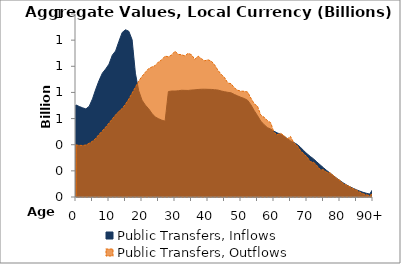
| Category | Public Transfers, Inflows | Public Transfers, Outflows |
|---|---|---|
| 0 | 703.988 | 397.538 |
|  | 692.429 | 395.395 |
| 2 | 682.373 | 394.039 |
| 3 | 673.781 | 397.855 |
| 4 | 693.748 | 410.843 |
| 5 | 750.663 | 426.653 |
| 6 | 825.399 | 448.756 |
| 7 | 892.271 | 479.111 |
| 8 | 947.813 | 505.609 |
| 9 | 979.52 | 534.789 |
| 10 | 1016.507 | 565.162 |
| 11 | 1084.725 | 597.148 |
| 12 | 1117.315 | 627.985 |
| 13 | 1190.292 | 655.109 |
| 14 | 1258.669 | 677.196 |
| 15 | 1279.497 | 710.413 |
| 16 | 1267.957 | 749.412 |
| 17 | 1203.711 | 795.012 |
| 18 | 947.044 | 839.92 |
| 19 | 813.417 | 886.302 |
| 20 | 740.835 | 922.697 |
| 21 | 703.402 | 953.783 |
| 22 | 675.582 | 982.051 |
| 23 | 639.759 | 994.708 |
| 24 | 612.16 | 1005.906 |
| 25 | 599.075 | 1033.315 |
| 26 | 587.662 | 1049.775 |
| 27 | 580.372 | 1077.929 |
| 28 | 806.477 | 1072.423 |
| 29 | 810.959 | 1086.735 |
| 30 | 810.624 | 1115.183 |
| 31 | 812.666 | 1091.091 |
| 32 | 816.584 | 1088.588 |
| 33 | 815.806 | 1079.487 |
| 34 | 815.218 | 1099.441 |
| 35 | 818.435 | 1088.16 |
| 36 | 819.839 | 1053.236 |
| 37 | 822.538 | 1077.811 |
| 38 | 824.343 | 1058.094 |
| 39 | 824.58 | 1042.285 |
| 40 | 823.686 | 1049.576 |
| 41 | 823.008 | 1039.666 |
| 42 | 820.368 | 1010.798 |
| 43 | 818.452 | 970.217 |
| 44 | 811.081 | 938.357 |
| 45 | 805.608 | 914.636 |
| 46 | 800.868 | 871.993 |
| 47 | 796.971 | 866.706 |
| 48 | 784.446 | 834.492 |
| 49 | 773.29 | 816.765 |
| 50 | 762.347 | 809.834 |
| 51 | 753.574 | 808.649 |
| 52 | 739.942 | 803.394 |
| 53 | 705.303 | 756.608 |
| 54 | 661.072 | 713.23 |
| 55 | 622.074 | 694.839 |
| 56 | 580.321 | 625.806 |
| 57 | 553.192 | 610.415 |
| 58 | 530.91 | 584.747 |
| 59 | 519.578 | 568.272 |
| 60 | 503.129 | 492.77 |
| 61 | 490.535 | 476.58 |
| 62 | 480.639 | 487.228 |
| 63 | 464.679 | 470.839 |
| 64 | 446.995 | 444.223 |
| 65 | 429.771 | 463.191 |
| 66 | 417.32 | 415.083 |
| 67 | 402.411 | 394.182 |
| 68 | 381.388 | 355.582 |
| 69 | 355.018 | 329.923 |
| 70 | 331.199 | 307.448 |
| 71 | 310.229 | 270.334 |
| 72 | 291.235 | 265.924 |
| 73 | 267.834 | 240.304 |
| 74 | 245.664 | 209.305 |
| 75 | 223.881 | 207.569 |
| 76 | 202.214 | 188.438 |
| 77 | 183.432 | 184.273 |
| 78 | 163.134 | 165.022 |
| 79 | 143.264 | 142.491 |
| 80 | 124.657 | 127.256 |
| 81 | 107.576 | 100.468 |
| 82 | 91.957 | 91.093 |
| 83 | 78.399 | 78.508 |
| 84 | 66.139 | 63.018 |
| 85 | 55.085 | 52.38 |
| 86 | 44.9 | 36.621 |
| 87 | 35.794 | 24.239 |
| 88 | 28.586 | 16.924 |
| 89 | 22.277 | 10.545 |
| 90+ | 61.832 | 27.595 |